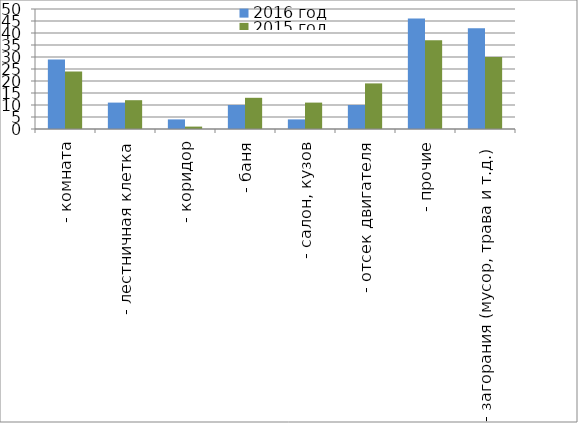
| Category | 2016 год | 2015 год |
|---|---|---|
|  - комната | 29 | 24 |
|  - лестничная клетка | 11 | 12 |
|  - коридор | 4 | 1 |
|  - баня | 10 | 13 |
|  - салон, кузов | 4 | 11 |
|  - отсек двигателя | 10 | 19 |
| - прочие | 46 | 37 |
| - загорания (мусор, трава и т.д.)  | 42 | 30 |